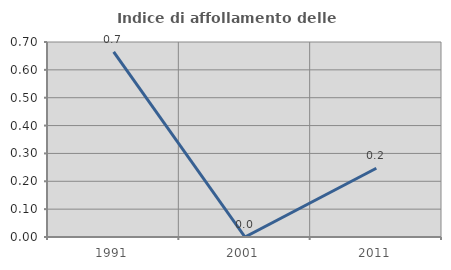
| Category | Indice di affollamento delle abitazioni  |
|---|---|
| 1991.0 | 0.664 |
| 2001.0 | 0 |
| 2011.0 | 0.247 |